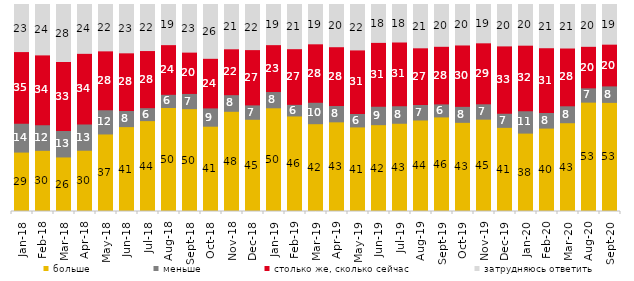
| Category | больше | меньше | столько же, сколько сейчас | затрудняюсь ответить |
|---|---|---|---|---|
| 2018-01-01 | 28.7 | 13.9 | 34.65 | 22.75 |
| 2018-02-01 | 29.55 | 12.4 | 33.7 | 24.35 |
| 2018-03-01 | 26.35 | 12.75 | 33.35 | 27.55 |
| 2018-04-01 | 29.6 | 12.7 | 34.1 | 23.6 |
| 2018-05-01 | 37.45 | 11.7 | 28.45 | 22.4 |
| 2018-06-01 | 41 | 7.8 | 27.85 | 23.35 |
| 2018-07-01 | 43.9 | 6.25 | 27.6 | 22.25 |
| 2018-08-01 | 50.25 | 6.35 | 24 | 19.4 |
| 2018-09-01 | 49.65 | 7.35 | 19.95 | 23 |
| 2018-10-01 | 41.2 | 8.85 | 23.95 | 26 |
| 2018-11-01 | 48.403 | 8.034 | 22.156 | 21.407 |
| 2018-12-01 | 44.55 | 6.95 | 26.7 | 21.8 |
| 2019-01-01 | 50.1 | 7.85 | 22.65 | 19.4 |
| 2019-02-01 | 46.15 | 5.6 | 26.9 | 21.35 |
| 2019-03-01 | 42.417 | 10.343 | 28.245 | 18.996 |
| 2019-04-01 | 43.317 | 7.871 | 28.416 | 20.396 |
| 2019-05-01 | 40.862 | 6.439 | 30.758 | 21.942 |
| 2019-06-01 | 41.945 | 8.878 | 30.873 | 18.304 |
| 2019-07-01 | 42.624 | 8.465 | 30.792 | 18.119 |
| 2019-08-01 | 44.206 | 7.493 | 27.373 | 20.929 |
| 2019-09-01 | 45.693 | 6.287 | 27.822 | 20.198 |
| 2019-10-01 | 43.069 | 7.723 | 29.653 | 19.554 |
| 2019-11-01 | 44.604 | 7.426 | 29.455 | 18.515 |
| 2019-12-01 | 40.644 | 6.782 | 32.574 | 20 |
| 2020-01-01 | 37.871 | 10.842 | 31.634 | 19.653 |
| 2020-02-01 | 40.297 | 7.525 | 31.287 | 20.891 |
| 2020-03-01 | 42.885 | 8.18 | 27.913 | 21.021 |
| 2020-08-01 | 52.83 | 6.902 | 20.06 | 20.209 |
| 2020-09-01 | 52.713 | 7.964 | 20.159 | 19.164 |